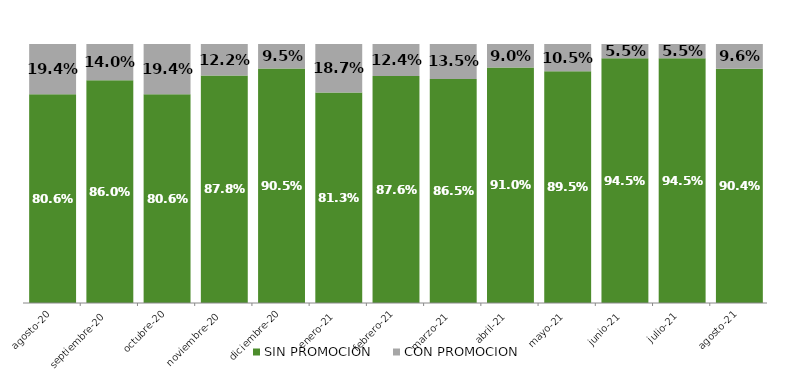
| Category | SIN PROMOCION   | CON PROMOCION   |
|---|---|---|
| 2020-08-01 | 0.806 | 0.194 |
| 2020-09-01 | 0.86 | 0.14 |
| 2020-10-01 | 0.806 | 0.194 |
| 2020-11-01 | 0.878 | 0.122 |
| 2020-12-01 | 0.905 | 0.095 |
| 2021-01-01 | 0.813 | 0.187 |
| 2021-02-01 | 0.876 | 0.124 |
| 2021-03-01 | 0.865 | 0.135 |
| 2021-04-01 | 0.91 | 0.09 |
| 2021-05-01 | 0.895 | 0.105 |
| 2021-06-01 | 0.945 | 0.055 |
| 2021-07-01 | 0.945 | 0.055 |
| 2021-08-01 | 0.904 | 0.096 |